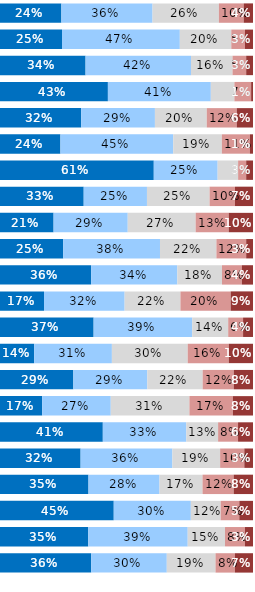
| Category | Almost Always or Always | Usually | Occasionally | Seldom | Never or Almost Never |
|---|---|---|---|---|---|
| Q1 | 0.243 | 0.36 | 0.262 | 0.098 | 0.037 |
| Q2 | 0.245 | 0.466 | 0.203 | 0.054 | 0.032 |
| Q3 | 0.338 | 0.417 | 0.164 | 0.054 | 0.027 |
| Q4 | 0.426 | 0.407 | 0.093 | 0.066 | 0.007 |
| Q5 | 0.321 | 0.291 | 0.205 | 0.119 | 0.064 |
| Q6 | 0.239 | 0.446 | 0.192 | 0.111 | 0.012 |
| Q7 | 0.608 | 0.252 | 0.081 | 0.032 | 0.027 |
| Q8 | 0.331 | 0.25 | 0.248 | 0.1 | 0.071 |
| Q9 | 0.212 | 0.293 | 0.268 | 0.131 | 0.096 |
| Q10 | 0.25 | 0.382 | 0.223 | 0.118 | 0.027 |
| Q11 | 0.36 | 0.341 | 0.176 | 0.078 | 0.044 |
| Q12 | 0.174 | 0.319 | 0.221 | 0.199 | 0.088 |
| Q13 | 0.37 | 0.39 | 0.142 | 0.059 | 0.039 |
| Q14 | 0.135 | 0.307 | 0.3 | 0.162 | 0.096 |
| Q15 | 0.29 | 0.292 | 0.219 | 0.123 | 0.076 |
| Q16 | 0.167 | 0.271 | 0.311 | 0.172 | 0.08 |
| Q17 | 0.406 | 0.33 | 0.126 | 0.079 | 0.059 |
| Q18 | 0.319 | 0.363 | 0.189 | 0.096 | 0.034 |
| Q19 | 0.35 | 0.281 | 0.17 | 0.123 | 0.076 |
| Q20 | 0.45 | 0.305 | 0.118 | 0.074 | 0.054 |
| Q21 | 0.349 | 0.393 | 0.147 | 0.079 | 0.032 |
| Q22 | 0.36 | 0.299 | 0.193 | 0.077 | 0.072 |